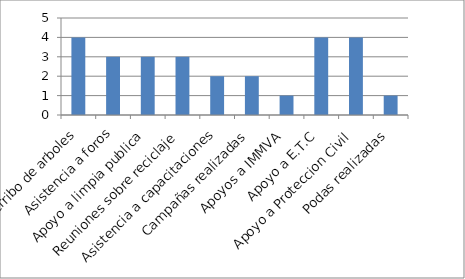
| Category | No.  |
|---|---|
| Derribo de arboles | 4 |
| Asistencia a foros | 3 |
| Apoyo a limpia publica | 3 |
| Reuniones sobre reciclaje | 3 |
| Asistencia a capacitaciones | 2 |
| Campañas realizadas | 2 |
| Apoyos a IMMVA | 1 |
| Apoyo a E.T.C | 4 |
| Apoyo a Proteccion Civil | 4 |
| Podas realizadas | 1 |